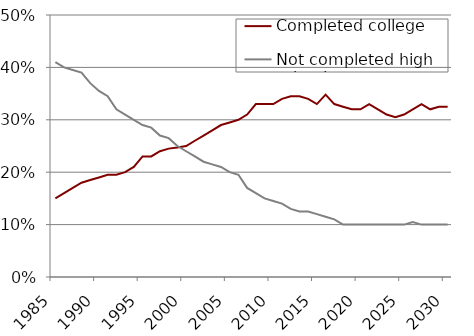
| Category | Completed college | Not completed high school |
|---|---|---|
| 1985.0 | 0.15 | 0.41 |
| 1986.0 | 0.16 | 0.4 |
| 1987.0 | 0.17 | 0.395 |
| 1988.0 | 0.18 | 0.39 |
| 1989.0 | 0.185 | 0.37 |
| 1990.0 | 0.19 | 0.355 |
| 1991.0 | 0.195 | 0.345 |
| 1992.0 | 0.195 | 0.32 |
| 1993.0 | 0.2 | 0.31 |
| 1994.0 | 0.21 | 0.3 |
| 1995.0 | 0.23 | 0.29 |
| 1996.0 | 0.23 | 0.285 |
| 1997.0 | 0.24 | 0.27 |
| 1998.0 | 0.245 | 0.265 |
| 1999.0 | 0.247 | 0.25 |
| 2000.0 | 0.25 | 0.24 |
| 2001.0 | 0.26 | 0.23 |
| 2002.0 | 0.27 | 0.22 |
| 2003.0 | 0.28 | 0.215 |
| 2004.0 | 0.29 | 0.21 |
| 2005.0 | 0.295 | 0.2 |
| 2006.0 | 0.3 | 0.195 |
| 2007.0 | 0.31 | 0.17 |
| 2008.0 | 0.33 | 0.16 |
| 2009.0 | 0.33 | 0.15 |
| 2010.0 | 0.33 | 0.145 |
| 2011.0 | 0.34 | 0.14 |
| 2012.0 | 0.345 | 0.13 |
| 2013.0 | 0.345 | 0.125 |
| 2014.0 | 0.34 | 0.125 |
| 2015.0 | 0.33 | 0.12 |
| 2016.0 | 0.348 | 0.115 |
| 2017.0 | 0.33 | 0.11 |
| 2018.0 | 0.325 | 0.1 |
| 2019.0 | 0.32 | 0.1 |
| 2020.0 | 0.32 | 0.1 |
| 2021.0 | 0.33 | 0.1 |
| 2022.0 | 0.32 | 0.1 |
| 2023.0 | 0.31 | 0.1 |
| 2024.0 | 0.305 | 0.1 |
| 2025.0 | 0.31 | 0.1 |
| 2026.0 | 0.32 | 0.105 |
| 2027.0 | 0.33 | 0.1 |
| 2028.0 | 0.32 | 0.1 |
| 2029.0 | 0.325 | 0.1 |
| 2030.0 | 0.325 | 0.1 |